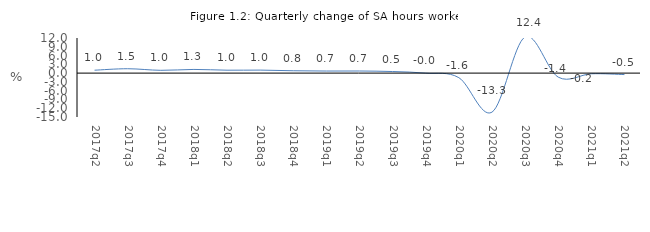
| Category | Series 0 |
|---|---|
| 2017q2 | 0.996 |
| 2017q3 | 1.496 |
| 2017q4 | 0.952 |
| 2018q1 | 1.258 |
| 2018q2 | 0.996 |
| 2018q3 | 1.028 |
| 2018q4 | 0.811 |
| 2019q1 | 0.707 |
| 2019q2 | 0.721 |
| 2019q3 | 0.542 |
| 2019q4 | -0.006 |
| 2020q1 | -1.561 |
| 2020q2 | -13.346 |
| 2020q3 | 12.387 |
| 2020q4 | -1.374 |
| 2021q1 | -0.23 |
| 2021q2 | -0.5 |